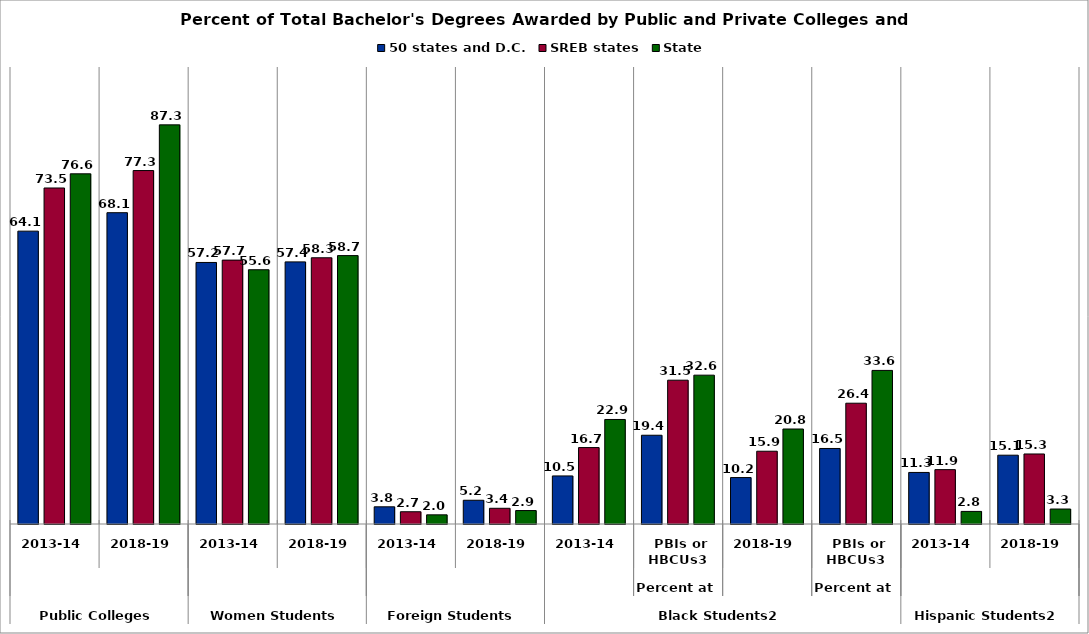
| Category | 50 states and D.C. | SREB states | State |
|---|---|---|---|
| 0 | 64.08 | 73.526 | 76.626 |
| 1 | 68.119 | 77.339 | 87.338 |
| 2 | 57.231 | 57.741 | 55.638 |
| 3 | 57.358 | 58.255 | 58.729 |
| 4 | 3.763 | 2.683 | 2.006 |
| 5 | 5.195 | 3.439 | 2.941 |
| 6 | 10.519 | 16.725 | 22.871 |
| 7 | 19.423 | 31.466 | 32.568 |
| 8 | 10.159 | 15.923 | 20.785 |
| 9 | 16.527 | 26.432 | 33.607 |
| 10 | 11.28 | 11.896 | 2.753 |
| 11 | 15.054 | 15.322 | 3.277 |